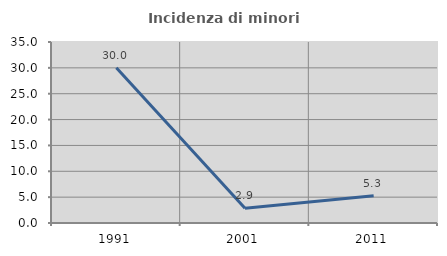
| Category | Incidenza di minori stranieri |
|---|---|
| 1991.0 | 30 |
| 2001.0 | 2.857 |
| 2011.0 | 5.263 |